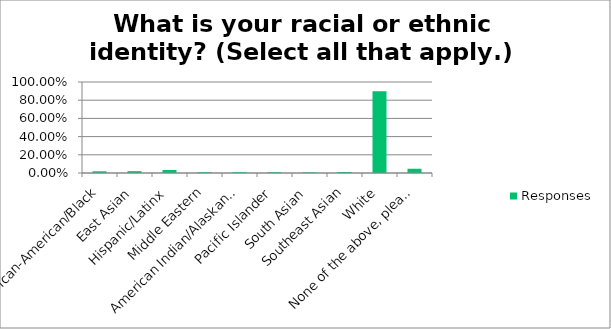
| Category | Responses |
|---|---|
| African-American/Black | 0.019 |
| East Asian | 0.02 |
| Hispanic/Latinx | 0.033 |
| Middle Eastern | 0.008 |
| American Indian/Alaskan Native | 0.008 |
| Pacific Islander | 0.008 |
| South Asian | 0.007 |
| Southeast Asian | 0.011 |
| White | 0.899 |
| None of the above, please specify... | 0.047 |